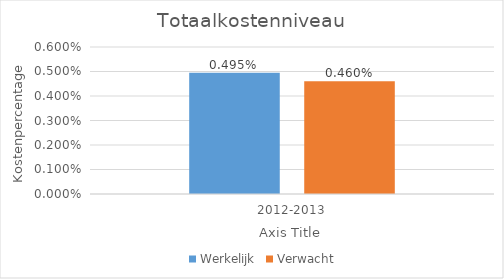
| Category | Werkelijk | Verwacht |
|---|---|---|
| 2012-2013 | 0.005 | 0.005 |